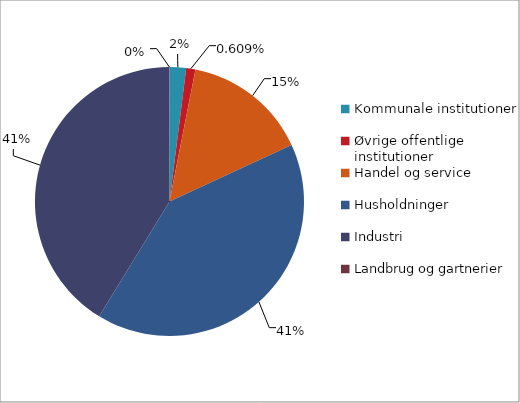
| Category | Series 0 |
|---|---|
| Kommunale institutioner | 6587 |
| Øvrige offentlige institutioner | 3672 |
| Handel og service | 49686 |
| Husholdninger | 134671 |
| Industri | 136531 |
| Landbrug og gartnerier | 105 |